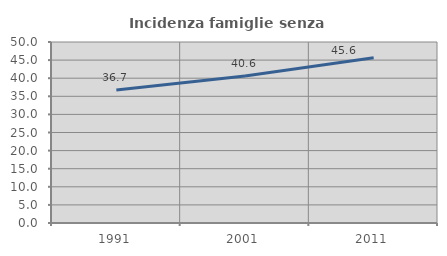
| Category | Incidenza famiglie senza nuclei |
|---|---|
| 1991.0 | 36.725 |
| 2001.0 | 40.635 |
| 2011.0 | 45.628 |